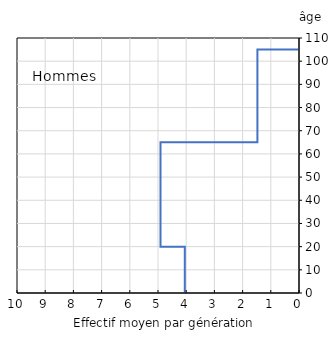
| Category | Hommes |
|---|---|
| -4.05 | 0 |
| -4.05 | 20 |
| -4.911111111111111 | 20 |
| -4.911111111111111 | 65 |
| -1.475 | 65 |
| -1.475 | 105 |
| 0.0 | 105 |